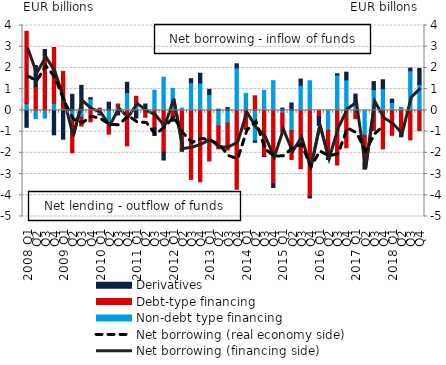
| Category | Non-debt type financing | Debt-type financing | Derivatives |
|---|---|---|---|
| 2008 Q1 | 0.322 | 3.407 | -0.797 |
| Q2 | -0.385 | 1.131 | 0.986 |
| Q3 | -0.364 | 2.578 | 0.292 |
| Q4 | 0.334 | 2.628 | -1.152 |
| 2009 Q1 | 0.096 | 1.742 | -1.358 |
| Q2 | -0.495 | -1.502 | 0.758 |
| Q3 | -0.31 | -0.426 | 1.181 |
| Q4 | 0.54 | -0.537 | 0.06 |
| 2010 Q1 | -0.188 | 0.108 | -0.028 |
| Q2 | -0.709 | -0.411 | 0.384 |
| Q3 | 0.167 | 0.134 | -0.216 |
| Q4 | 0.841 | -1.672 | 0.485 |
| 2011 Q1 | 0.279 | 0.384 | -0.362 |
| Q2 | -0.045 | -0.279 | 0.301 |
| Q3 | 0.951 | -0.827 | -0.355 |
| Q4 | 1.566 | -1.967 | -0.372 |
| 2012 Q1 | 1.038 | -0.282 | -0.228 |
| Q2 | 0.107 | -1.816 | -0.112 |
| Q3 | 1.307 | -3.251 | 0.185 |
| Q4 | 1.29 | -3.363 | 0.461 |
| 2013 Q1 | 0.752 | -2.385 | 0.238 |
| Q2 | -0.734 | -1.079 | 0.057 |
| Q3 | -0.601 | -1.268 | 0.129 |
| Q4 | 2.002 | -3.715 | 0.193 |
| 2014 Q1 | 0.8 | -0.873 | -0.015 |
| Q2 | -1.445 | 0.687 | -0.062 |
| Q3 | 0.944 | -2.164 | -0.012 |
| Q4 | 1.399 | -3.458 | -0.175 |
| 2015 Q1 | -0.131 | -0.886 | 0.108 |
| Q2 | -0.948 | -1.363 | 0.349 |
| Q3 | 1.187 | -2.748 | 0.289 |
| Q4 | 1.397 | -4.068 | -0.059 |
| 2016 Q1 | -0.017 | -0.282 | -0.406 |
| Q2 | -0.933 | -1.305 | -0.078 |
| Q3 | 1.66 | -2.574 | 0.07 |
| Q4 | 1.44 | -1.763 | 0.361 |
| 2017 Q1 | 0.285 | -0.396 | 0.483 |
| Q2 | -1.179 | -1.332 | -0.257 |
| Q3 | 0.978 | -0.946 | 0.378 |
| Q4 | 1.022 | -1.815 | 0.419 |
| 2018 Q1 | 0.371 | -1.175 | 0.159 |
| Q2 | 0.137 | -1.136 | -0.11 |
| Q3 | 1.869 | -1.392 | 0.124 |
| Q4 | 1.218 | -0.953 | 0.759 |